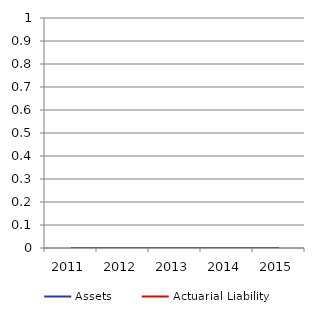
| Category |  Assets  |  Actuarial Liability  |
|---|---|---|
| 2011.0 | 0 | 0 |
| 2012.0 | 0 | 0 |
| 2013.0 | 0 | 0 |
| 2014.0 | 0 | 0 |
| 2015.0 | 0 | 0 |